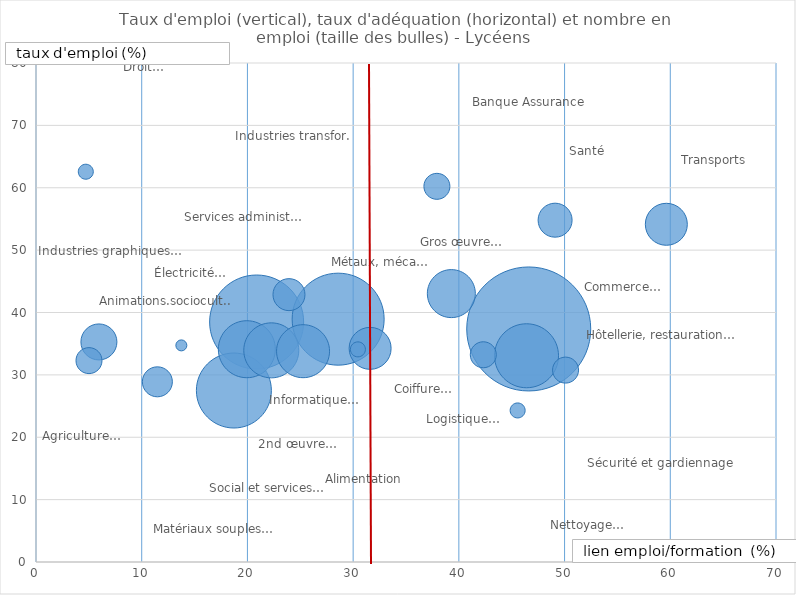
| Category | Taux d'emploi |
|---|---|
| 46.61 | 37.36 |
| 20.85 | 38.51 |
| 28.54 | 39 |
| 18.68 | 27.56 |
| 46.38 | 33.1 |
| 19.9 | 34.19 |
| 22.21 | 34.01 |
| 25.26 | 33.8 |
| 39.26 | 43.08 |
| 59.58 | 54.22 |
| 31.56 | 34.33 |
| 5.91 | 35.35 |
| 49.08 | 54.84 |
| 23.92 | 42.88 |
| 11.48 | 28.89 |
| 42.31 | 33.23 |
| 50.09 | 30.77 |
| 5.01 | 32.29 |
| 37.92 | 60.23 |
| 30.45 | 34.09 |
| 4.71 | 62.57 |
| 45.56 | 24.3 |
| 13.73 | 34.76 |